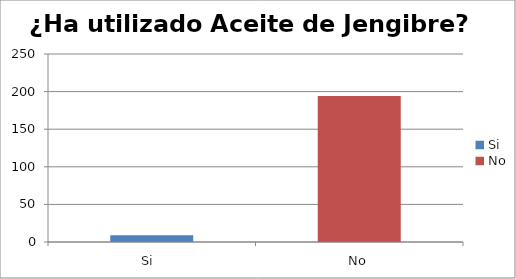
| Category | ¿Ha utilizado Aceite de Jengibre? |
|---|---|
| Si  | 9 |
| No | 194 |